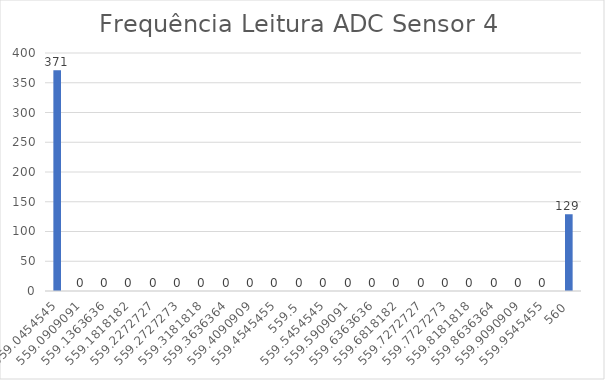
| Category | Series 0 |
|---|---|
| 559.0454545454545 | 371 |
| 559.0909090909091 | 0 |
| 559.1363636363636 | 0 |
| 559.1818181818181 | 0 |
| 559.2272727272727 | 0 |
| 559.2727272727273 | 0 |
| 559.3181818181819 | 0 |
| 559.3636363636364 | 0 |
| 559.4090909090909 | 0 |
| 559.4545454545455 | 0 |
| 559.5 | 0 |
| 559.5454545454545 | 0 |
| 559.5909090909091 | 0 |
| 559.6363636363636 | 0 |
| 559.6818181818181 | 0 |
| 559.7272727272727 | 0 |
| 559.7727272727273 | 0 |
| 559.8181818181819 | 0 |
| 559.8636363636364 | 0 |
| 559.9090909090909 | 0 |
| 559.9545454545455 | 0 |
| 560.0 | 129 |